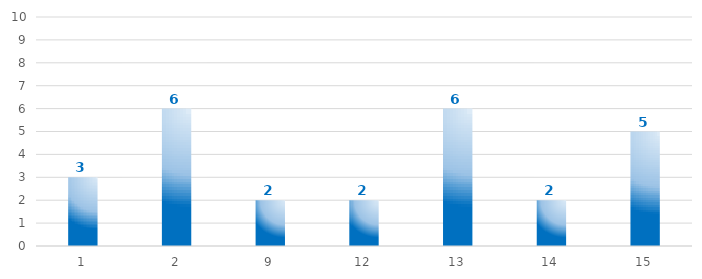
| Category | Iniciativas |
|---|---|
| 1.0 | 3 |
| 2.0 | 6 |
| 9.0 | 2 |
| 12.0 | 2 |
| 13.0 | 6 |
| 14.0 | 2 |
| 15.0 | 5 |